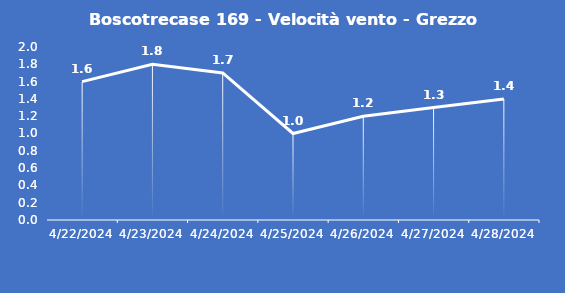
| Category | Boscotrecase 169 - Velocità vento - Grezzo (m/s) |
|---|---|
| 4/22/24 | 1.6 |
| 4/23/24 | 1.8 |
| 4/24/24 | 1.7 |
| 4/25/24 | 1 |
| 4/26/24 | 1.2 |
| 4/27/24 | 1.3 |
| 4/28/24 | 1.4 |